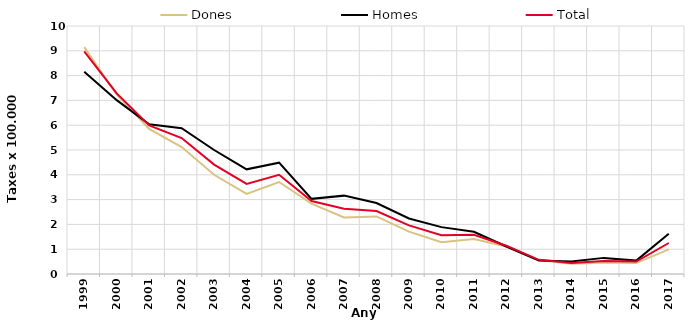
| Category | Dones | Homes | Total |
|---|---|---|---|
| 1999.0 | 9.15 | 8.16 | 8.98 |
| 2000.0 | 7.23 | 7.01 | 7.28 |
| 2001.0 | 5.85 | 6.04 | 5.99 |
| 2002.0 | 5.12 | 5.88 | 5.48 |
| 2003.0 | 4 | 5 | 4.41 |
| 2004.0 | 3.23 | 4.22 | 3.63 |
| 2005.0 | 3.71 | 4.49 | 4 |
| 2006.0 | 2.84 | 3.03 | 2.94 |
| 2007.0 | 2.28 | 3.16 | 2.63 |
| 2008.0 | 2.32 | 2.86 | 2.54 |
| 2009.0 | 1.71 | 2.24 | 1.96 |
| 2010.0 | 1.28 | 1.89 | 1.56 |
| 2011.0 | 1.41 | 1.7 | 1.58 |
| 2012.0 | 1.11 | 1.11 | 1.14 |
| 2013.0 | 0.56 | 0.54 | 0.57 |
| 2014.0 | 0.41 | 0.5 | 0.44 |
| 2015.0 | 0.46 | 0.65 | 0.52 |
| 2016.0 | 0.44 | 0.54 | 0.5 |
| 2017.0 | 0.99 | 1.62 | 1.25 |